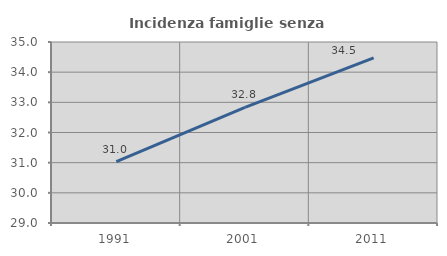
| Category | Incidenza famiglie senza nuclei |
|---|---|
| 1991.0 | 31.034 |
| 2001.0 | 32.83 |
| 2011.0 | 34.471 |